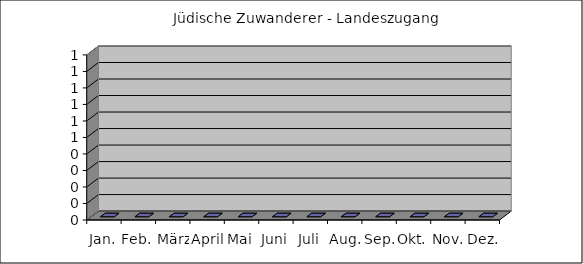
| Category | Jüdische Zuwanderer - Landeszugang |
|---|---|
| Jan. | 0 |
| Feb. | 0 |
| März | 0 |
| April | 0 |
| Mai | 0 |
| Juni | 0 |
| Juli | 0 |
| Aug. | 0 |
| Sep. | 0 |
| Okt. | 0 |
| Nov. | 0 |
| Dez. | 0 |